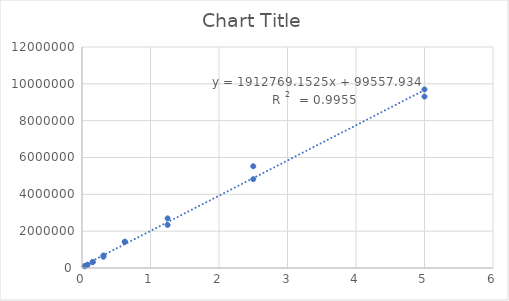
| Category | Series 0 |
|---|---|
| 0.039 | 106016 |
| 0.039 | 87430 |
| 0.078 | 167691 |
| 0.078 | 172821 |
| 0.156 | 320500 |
| 0.156 | 320524 |
| 0.313 | 683684 |
| 0.313 | 610791 |
| 0.625 | 1430350 |
| 0.625 | 1413649 |
| 1.25 | 2338073 |
| 1.25 | 2694396 |
| 2.5 | 5524869 |
| 2.5 | 4824375 |
| 5.0 | 9307203 |
| 5.0 | 9696742 |